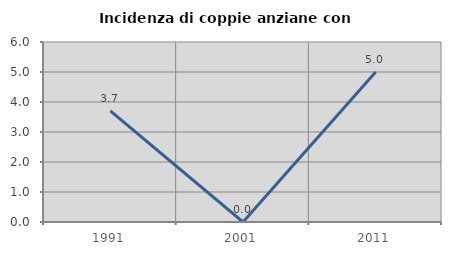
| Category | Incidenza di coppie anziane con figli |
|---|---|
| 1991.0 | 3.704 |
| 2001.0 | 0 |
| 2011.0 | 5 |